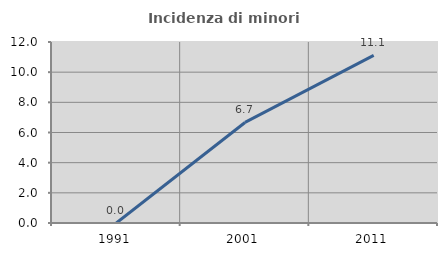
| Category | Incidenza di minori stranieri |
|---|---|
| 1991.0 | 0 |
| 2001.0 | 6.667 |
| 2011.0 | 11.111 |